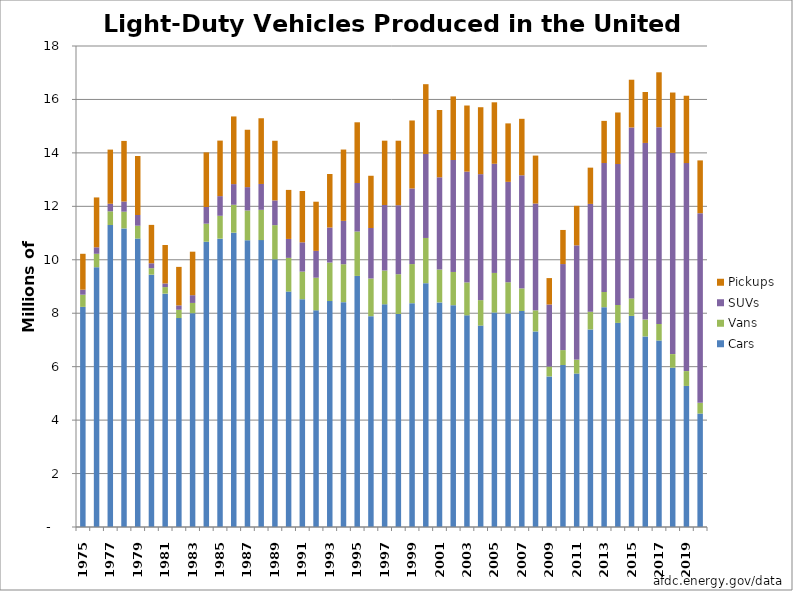
| Category | Cars | Vans | SUVs | Pickups |
|---|---|---|---|---|
| 1975.0 | 8237 | 457 | 187 | 1343 |
| 1976.0 | 9722 | 502 | 243 | 1866 |
| 1977.0 | 11300 | 514 | 283 | 2026 |
| 1978.0 | 11175 | 625 | 380 | 2268 |
| 1979.0 | 10794 | 481 | 401 | 2207 |
| 1980.0 | 9443 | 242 | 184 | 1437 |
| 1981.0 | 8733 | 245 | 136 | 1440 |
| 1982.0 | 7819 | 311 | 163 | 1441 |
| 1983.0 | 8002 | 383 | 290 | 1628 |
| 1984.0 | 10675 | 676 | 625 | 2043 |
| 1985.0 | 10791 | 855 | 736 | 2078 |
| 1986.0 | 11015 | 1044 | 773 | 2532 |
| 1987.0 | 10731 | 1114 | 874 | 2147 |
| 1988.0 | 10736 | 1133 | 968 | 2459 |
| 1989.0 | 10018 | 1278 | 926 | 2232 |
| 1990.0 | 8810 | 1262 | 708 | 1835 |
| 1991.0 | 8524 | 1034 | 1095 | 1920 |
| 1992.0 | 8108 | 1221 | 1004 | 1840 |
| 1993.0 | 8456 | 1441 | 1311 | 2002 |
| 1994.0 | 8415 | 1418 | 1623 | 2669 |
| 1995.0 | 9396 | 1662 | 1816 | 2271 |
| 1996.0 | 7890 | 1409 | 1890 | 1955 |
| 1997.0 | 8334 | 1265 | 2450 | 2408 |
| 1998.0 | 7971 | 1489 | 2581 | 2415 |
| 1999.0 | 8376 | 1463 | 2830 | 2544 |
| 2000.0 | 9125 | 1691 | 3143 | 2612 |
| 2001.0 | 8405 | 1232 | 3450 | 2519 |
| 2002.0 | 8301 | 1243 | 4190 | 2380 |
| 2003.0 | 7921 | 1232 | 4146 | 2474 |
| 2004.0 | 7537 | 953 | 4714 | 2505 |
| 2005.0 | 8027 | 1481 | 4085 | 2300 |
| 2006.0 | 7993 | 1166 | 3757 | 2188 |
| 2007.0 | 8082 | 847 | 4233 | 2113 |
| 2008.0 | 7319 | 790 | 3996 | 1794 |
| 2009.0 | 5636 | 368 | 2322 | 989 |
| 2010.0 | 6061 | 559 | 3220 | 1276 |
| 2011.0 | 5743 | 521 | 4276 | 1479 |
| 2012.0 | 7393 | 662 | 4036 | 1357 |
| 2013.0 | 8226 | 571 | 4824 | 1577 |
| 2014.0 | 7639 | 672 | 5272 | 1929 |
| 2015.0 | 7899 | 655 | 6398 | 1786 |
| 2016.0 | 7131 | 630 | 6611 | 1907 |
| 2017.0 | 6979 | 617 | 7366 | 2054 |
| 2018.0 | 5962 | 508 | 7530 | 2259 |
| 2019.0 | 5279 | 555 | 7784 | 2521 |
| 2020.0 | 4245 | 401 | 7098 | 1975 |